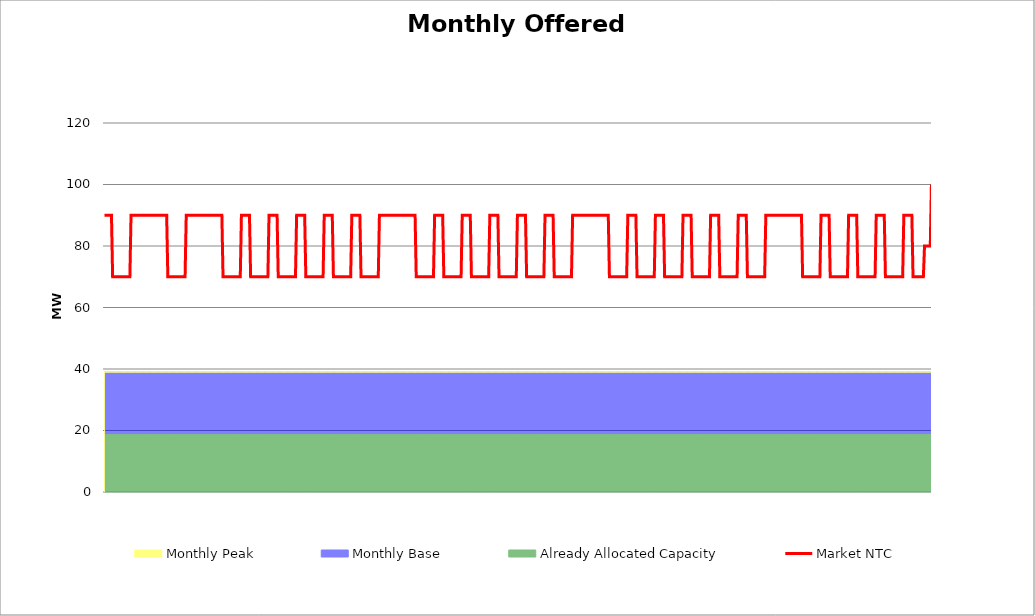
| Category | Market NTC |
|---|---|
| 0 | 90 |
| 1 | 90 |
| 2 | 90 |
| 3 | 90 |
| 4 | 90 |
| 5 | 90 |
| 6 | 90 |
| 7 | 70 |
| 8 | 70 |
| 9 | 70 |
| 10 | 70 |
| 11 | 70 |
| 12 | 70 |
| 13 | 70 |
| 14 | 70 |
| 15 | 70 |
| 16 | 70 |
| 17 | 70 |
| 18 | 70 |
| 19 | 70 |
| 20 | 70 |
| 21 | 70 |
| 22 | 70 |
| 23 | 90 |
| 24 | 90 |
| 25 | 90 |
| 26 | 90 |
| 27 | 90 |
| 28 | 90 |
| 29 | 90 |
| 30 | 90 |
| 31 | 90 |
| 32 | 90 |
| 33 | 90 |
| 34 | 90 |
| 35 | 90 |
| 36 | 90 |
| 37 | 90 |
| 38 | 90 |
| 39 | 90 |
| 40 | 90 |
| 41 | 90 |
| 42 | 90 |
| 43 | 90 |
| 44 | 90 |
| 45 | 90 |
| 46 | 90 |
| 47 | 90 |
| 48 | 90 |
| 49 | 90 |
| 50 | 90 |
| 51 | 90 |
| 52 | 90 |
| 53 | 90 |
| 54 | 90 |
| 55 | 70 |
| 56 | 70 |
| 57 | 70 |
| 58 | 70 |
| 59 | 70 |
| 60 | 70 |
| 61 | 70 |
| 62 | 70 |
| 63 | 70 |
| 64 | 70 |
| 65 | 70 |
| 66 | 70 |
| 67 | 70 |
| 68 | 70 |
| 69 | 70 |
| 70 | 70 |
| 71 | 90 |
| 72 | 90 |
| 73 | 90 |
| 74 | 90 |
| 75 | 90 |
| 76 | 90 |
| 77 | 90 |
| 78 | 90 |
| 79 | 90 |
| 80 | 90 |
| 81 | 90 |
| 82 | 90 |
| 83 | 90 |
| 84 | 90 |
| 85 | 90 |
| 86 | 90 |
| 87 | 90 |
| 88 | 90 |
| 89 | 90 |
| 90 | 90 |
| 91 | 90 |
| 92 | 90 |
| 93 | 90 |
| 94 | 90 |
| 95 | 90 |
| 96 | 90 |
| 97 | 90 |
| 98 | 90 |
| 99 | 90 |
| 100 | 90 |
| 101 | 90 |
| 102 | 90 |
| 103 | 70 |
| 104 | 70 |
| 105 | 70 |
| 106 | 70 |
| 107 | 70 |
| 108 | 70 |
| 109 | 70 |
| 110 | 70 |
| 111 | 70 |
| 112 | 70 |
| 113 | 70 |
| 114 | 70 |
| 115 | 70 |
| 116 | 70 |
| 117 | 70 |
| 118 | 70 |
| 119 | 90 |
| 120 | 90 |
| 121 | 90 |
| 122 | 90 |
| 123 | 90 |
| 124 | 90 |
| 125 | 90 |
| 126 | 90 |
| 127 | 70 |
| 128 | 70 |
| 129 | 70 |
| 130 | 70 |
| 131 | 70 |
| 132 | 70 |
| 133 | 70 |
| 134 | 70 |
| 135 | 70 |
| 136 | 70 |
| 137 | 70 |
| 138 | 70 |
| 139 | 70 |
| 140 | 70 |
| 141 | 70 |
| 142 | 70 |
| 143 | 90 |
| 144 | 90 |
| 145 | 90 |
| 146 | 90 |
| 147 | 90 |
| 148 | 90 |
| 149 | 90 |
| 150 | 90 |
| 151 | 70 |
| 152 | 70 |
| 153 | 70 |
| 154 | 70 |
| 155 | 70 |
| 156 | 70 |
| 157 | 70 |
| 158 | 70 |
| 159 | 70 |
| 160 | 70 |
| 161 | 70 |
| 162 | 70 |
| 163 | 70 |
| 164 | 70 |
| 165 | 70 |
| 166 | 70 |
| 167 | 90 |
| 168 | 90 |
| 169 | 90 |
| 170 | 90 |
| 171 | 90 |
| 172 | 90 |
| 173 | 90 |
| 174 | 90 |
| 175 | 70 |
| 176 | 70 |
| 177 | 70 |
| 178 | 70 |
| 179 | 70 |
| 180 | 70 |
| 181 | 70 |
| 182 | 70 |
| 183 | 70 |
| 184 | 70 |
| 185 | 70 |
| 186 | 70 |
| 187 | 70 |
| 188 | 70 |
| 189 | 70 |
| 190 | 70 |
| 191 | 90 |
| 192 | 90 |
| 193 | 90 |
| 194 | 90 |
| 195 | 90 |
| 196 | 90 |
| 197 | 90 |
| 198 | 90 |
| 199 | 70 |
| 200 | 70 |
| 201 | 70 |
| 202 | 70 |
| 203 | 70 |
| 204 | 70 |
| 205 | 70 |
| 206 | 70 |
| 207 | 70 |
| 208 | 70 |
| 209 | 70 |
| 210 | 70 |
| 211 | 70 |
| 212 | 70 |
| 213 | 70 |
| 214 | 70 |
| 215 | 90 |
| 216 | 90 |
| 217 | 90 |
| 218 | 90 |
| 219 | 90 |
| 220 | 90 |
| 221 | 90 |
| 222 | 90 |
| 223 | 70 |
| 224 | 70 |
| 225 | 70 |
| 226 | 70 |
| 227 | 70 |
| 228 | 70 |
| 229 | 70 |
| 230 | 70 |
| 231 | 70 |
| 232 | 70 |
| 233 | 70 |
| 234 | 70 |
| 235 | 70 |
| 236 | 70 |
| 237 | 70 |
| 238 | 70 |
| 239 | 90 |
| 240 | 90 |
| 241 | 90 |
| 242 | 90 |
| 243 | 90 |
| 244 | 90 |
| 245 | 90 |
| 246 | 90 |
| 247 | 90 |
| 248 | 90 |
| 249 | 90 |
| 250 | 90 |
| 251 | 90 |
| 252 | 90 |
| 253 | 90 |
| 254 | 90 |
| 255 | 90 |
| 256 | 90 |
| 257 | 90 |
| 258 | 90 |
| 259 | 90 |
| 260 | 90 |
| 261 | 90 |
| 262 | 90 |
| 263 | 90 |
| 264 | 90 |
| 265 | 90 |
| 266 | 90 |
| 267 | 90 |
| 268 | 90 |
| 269 | 90 |
| 270 | 90 |
| 271 | 70 |
| 272 | 70 |
| 273 | 70 |
| 274 | 70 |
| 275 | 70 |
| 276 | 70 |
| 277 | 70 |
| 278 | 70 |
| 279 | 70 |
| 280 | 70 |
| 281 | 70 |
| 282 | 70 |
| 283 | 70 |
| 284 | 70 |
| 285 | 70 |
| 286 | 70 |
| 287 | 90 |
| 288 | 90 |
| 289 | 90 |
| 290 | 90 |
| 291 | 90 |
| 292 | 90 |
| 293 | 90 |
| 294 | 90 |
| 295 | 70 |
| 296 | 70 |
| 297 | 70 |
| 298 | 70 |
| 299 | 70 |
| 300 | 70 |
| 301 | 70 |
| 302 | 70 |
| 303 | 70 |
| 304 | 70 |
| 305 | 70 |
| 306 | 70 |
| 307 | 70 |
| 308 | 70 |
| 309 | 70 |
| 310 | 70 |
| 311 | 90 |
| 312 | 90 |
| 313 | 90 |
| 314 | 90 |
| 315 | 90 |
| 316 | 90 |
| 317 | 90 |
| 318 | 90 |
| 319 | 70 |
| 320 | 70 |
| 321 | 70 |
| 322 | 70 |
| 323 | 70 |
| 324 | 70 |
| 325 | 70 |
| 326 | 70 |
| 327 | 70 |
| 328 | 70 |
| 329 | 70 |
| 330 | 70 |
| 331 | 70 |
| 332 | 70 |
| 333 | 70 |
| 334 | 70 |
| 335 | 90 |
| 336 | 90 |
| 337 | 90 |
| 338 | 90 |
| 339 | 90 |
| 340 | 90 |
| 341 | 90 |
| 342 | 90 |
| 343 | 70 |
| 344 | 70 |
| 345 | 70 |
| 346 | 70 |
| 347 | 70 |
| 348 | 70 |
| 349 | 70 |
| 350 | 70 |
| 351 | 70 |
| 352 | 70 |
| 353 | 70 |
| 354 | 70 |
| 355 | 70 |
| 356 | 70 |
| 357 | 70 |
| 358 | 70 |
| 359 | 90 |
| 360 | 90 |
| 361 | 90 |
| 362 | 90 |
| 363 | 90 |
| 364 | 90 |
| 365 | 90 |
| 366 | 90 |
| 367 | 70 |
| 368 | 70 |
| 369 | 70 |
| 370 | 70 |
| 371 | 70 |
| 372 | 70 |
| 373 | 70 |
| 374 | 70 |
| 375 | 70 |
| 376 | 70 |
| 377 | 70 |
| 378 | 70 |
| 379 | 70 |
| 380 | 70 |
| 381 | 70 |
| 382 | 70 |
| 383 | 90 |
| 384 | 90 |
| 385 | 90 |
| 386 | 90 |
| 387 | 90 |
| 388 | 90 |
| 389 | 90 |
| 390 | 90 |
| 391 | 70 |
| 392 | 70 |
| 393 | 70 |
| 394 | 70 |
| 395 | 70 |
| 396 | 70 |
| 397 | 70 |
| 398 | 70 |
| 399 | 70 |
| 400 | 70 |
| 401 | 70 |
| 402 | 70 |
| 403 | 70 |
| 404 | 70 |
| 405 | 70 |
| 406 | 70 |
| 407 | 90 |
| 408 | 90 |
| 409 | 90 |
| 410 | 90 |
| 411 | 90 |
| 412 | 90 |
| 413 | 90 |
| 414 | 90 |
| 415 | 90 |
| 416 | 90 |
| 417 | 90 |
| 418 | 90 |
| 419 | 90 |
| 420 | 90 |
| 421 | 90 |
| 422 | 90 |
| 423 | 90 |
| 424 | 90 |
| 425 | 90 |
| 426 | 90 |
| 427 | 90 |
| 428 | 90 |
| 429 | 90 |
| 430 | 90 |
| 431 | 90 |
| 432 | 90 |
| 433 | 90 |
| 434 | 90 |
| 435 | 90 |
| 436 | 90 |
| 437 | 90 |
| 438 | 90 |
| 439 | 70 |
| 440 | 70 |
| 441 | 70 |
| 442 | 70 |
| 443 | 70 |
| 444 | 70 |
| 445 | 70 |
| 446 | 70 |
| 447 | 70 |
| 448 | 70 |
| 449 | 70 |
| 450 | 70 |
| 451 | 70 |
| 452 | 70 |
| 453 | 70 |
| 454 | 70 |
| 455 | 90 |
| 456 | 90 |
| 457 | 90 |
| 458 | 90 |
| 459 | 90 |
| 460 | 90 |
| 461 | 90 |
| 462 | 90 |
| 463 | 70 |
| 464 | 70 |
| 465 | 70 |
| 466 | 70 |
| 467 | 70 |
| 468 | 70 |
| 469 | 70 |
| 470 | 70 |
| 471 | 70 |
| 472 | 70 |
| 473 | 70 |
| 474 | 70 |
| 475 | 70 |
| 476 | 70 |
| 477 | 70 |
| 478 | 70 |
| 479 | 90 |
| 480 | 90 |
| 481 | 90 |
| 482 | 90 |
| 483 | 90 |
| 484 | 90 |
| 485 | 90 |
| 486 | 90 |
| 487 | 70 |
| 488 | 70 |
| 489 | 70 |
| 490 | 70 |
| 491 | 70 |
| 492 | 70 |
| 493 | 70 |
| 494 | 70 |
| 495 | 70 |
| 496 | 70 |
| 497 | 70 |
| 498 | 70 |
| 499 | 70 |
| 500 | 70 |
| 501 | 70 |
| 502 | 70 |
| 503 | 90 |
| 504 | 90 |
| 505 | 90 |
| 506 | 90 |
| 507 | 90 |
| 508 | 90 |
| 509 | 90 |
| 510 | 90 |
| 511 | 70 |
| 512 | 70 |
| 513 | 70 |
| 514 | 70 |
| 515 | 70 |
| 516 | 70 |
| 517 | 70 |
| 518 | 70 |
| 519 | 70 |
| 520 | 70 |
| 521 | 70 |
| 522 | 70 |
| 523 | 70 |
| 524 | 70 |
| 525 | 70 |
| 526 | 70 |
| 527 | 90 |
| 528 | 90 |
| 529 | 90 |
| 530 | 90 |
| 531 | 90 |
| 532 | 90 |
| 533 | 90 |
| 534 | 90 |
| 535 | 70 |
| 536 | 70 |
| 537 | 70 |
| 538 | 70 |
| 539 | 70 |
| 540 | 70 |
| 541 | 70 |
| 542 | 70 |
| 543 | 70 |
| 544 | 70 |
| 545 | 70 |
| 546 | 70 |
| 547 | 70 |
| 548 | 70 |
| 549 | 70 |
| 550 | 70 |
| 551 | 90 |
| 552 | 90 |
| 553 | 90 |
| 554 | 90 |
| 555 | 90 |
| 556 | 90 |
| 557 | 90 |
| 558 | 90 |
| 559 | 70 |
| 560 | 70 |
| 561 | 70 |
| 562 | 70 |
| 563 | 70 |
| 564 | 70 |
| 565 | 70 |
| 566 | 70 |
| 567 | 70 |
| 568 | 70 |
| 569 | 70 |
| 570 | 70 |
| 571 | 70 |
| 572 | 70 |
| 573 | 70 |
| 574 | 70 |
| 575 | 90 |
| 576 | 90 |
| 577 | 90 |
| 578 | 90 |
| 579 | 90 |
| 580 | 90 |
| 581 | 90 |
| 582 | 90 |
| 583 | 90 |
| 584 | 90 |
| 585 | 90 |
| 586 | 90 |
| 587 | 90 |
| 588 | 90 |
| 589 | 90 |
| 590 | 90 |
| 591 | 90 |
| 592 | 90 |
| 593 | 90 |
| 594 | 90 |
| 595 | 90 |
| 596 | 90 |
| 597 | 90 |
| 598 | 90 |
| 599 | 90 |
| 600 | 90 |
| 601 | 90 |
| 602 | 90 |
| 603 | 90 |
| 604 | 90 |
| 605 | 90 |
| 606 | 90 |
| 607 | 70 |
| 608 | 70 |
| 609 | 70 |
| 610 | 70 |
| 611 | 70 |
| 612 | 70 |
| 613 | 70 |
| 614 | 70 |
| 615 | 70 |
| 616 | 70 |
| 617 | 70 |
| 618 | 70 |
| 619 | 70 |
| 620 | 70 |
| 621 | 70 |
| 622 | 70 |
| 623 | 90 |
| 624 | 90 |
| 625 | 90 |
| 626 | 90 |
| 627 | 90 |
| 628 | 90 |
| 629 | 90 |
| 630 | 90 |
| 631 | 70 |
| 632 | 70 |
| 633 | 70 |
| 634 | 70 |
| 635 | 70 |
| 636 | 70 |
| 637 | 70 |
| 638 | 70 |
| 639 | 70 |
| 640 | 70 |
| 641 | 70 |
| 642 | 70 |
| 643 | 70 |
| 644 | 70 |
| 645 | 70 |
| 646 | 70 |
| 647 | 90 |
| 648 | 90 |
| 649 | 90 |
| 650 | 90 |
| 651 | 90 |
| 652 | 90 |
| 653 | 90 |
| 654 | 90 |
| 655 | 70 |
| 656 | 70 |
| 657 | 70 |
| 658 | 70 |
| 659 | 70 |
| 660 | 70 |
| 661 | 70 |
| 662 | 70 |
| 663 | 70 |
| 664 | 70 |
| 665 | 70 |
| 666 | 70 |
| 667 | 70 |
| 668 | 70 |
| 669 | 70 |
| 670 | 70 |
| 671 | 90 |
| 672 | 90 |
| 673 | 90 |
| 674 | 90 |
| 675 | 90 |
| 676 | 90 |
| 677 | 90 |
| 678 | 90 |
| 679 | 70 |
| 680 | 70 |
| 681 | 70 |
| 682 | 70 |
| 683 | 70 |
| 684 | 70 |
| 685 | 70 |
| 686 | 70 |
| 687 | 70 |
| 688 | 70 |
| 689 | 70 |
| 690 | 70 |
| 691 | 70 |
| 692 | 70 |
| 693 | 70 |
| 694 | 70 |
| 695 | 90 |
| 696 | 90 |
| 697 | 90 |
| 698 | 90 |
| 699 | 90 |
| 700 | 90 |
| 701 | 90 |
| 702 | 90 |
| 703 | 70 |
| 704 | 70 |
| 705 | 70 |
| 706 | 70 |
| 707 | 70 |
| 708 | 70 |
| 709 | 70 |
| 710 | 70 |
| 711 | 70 |
| 712 | 70 |
| 713 | 80 |
| 714 | 80 |
| 715 | 80 |
| 716 | 80 |
| 717 | 80 |
| 718 | 80 |
| 719 | 100 |